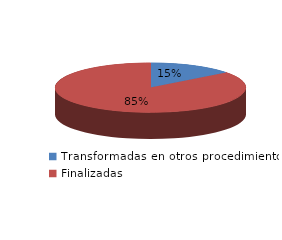
| Category | Series 0 |
|---|---|
| Transformadas en otros procedimientos | 3160 |
| Finalizadas | 18605 |